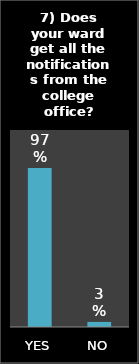
| Category | Series 0 |
|---|---|
| YES | 0.969 |
| NO | 0.031 |